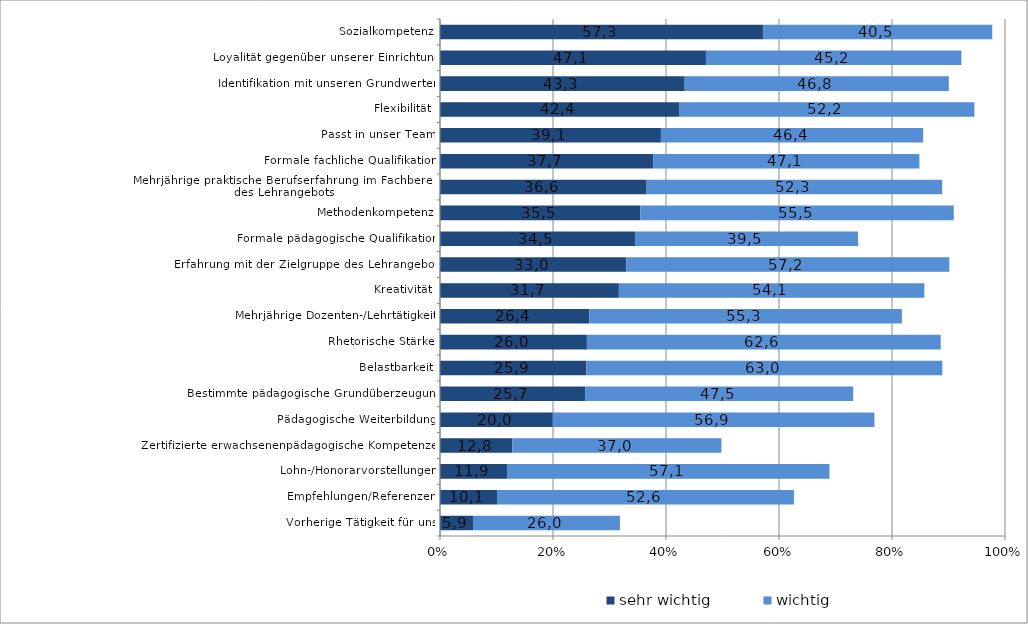
| Category | sehr wichtig | wichtig |
|---|---|---|
| Vorherige Tätigkeit für uns | 0.058 | 0.26 |
| Empfehlungen/Referenzen | 0.101 | 0.526 |
| Lohn-/Honorarvorstellungen | 0.119 | 0.571 |
| Zertifizierte erwachsenenpädagogische Kompetenzen | 0.128 | 0.37 |
| Pädagogische Weiterbildung | 0.2 | 0.569 |
| Bestimmte pädagogische Grundüberzeugung | 0.257 | 0.474 |
| Belastbarkeit | 0.259 | 0.63 |
| Rhetorische Stärke | 0.26 | 0.626 |
| Mehrjährige Dozenten-/Lehrtätigkeit | 0.264 | 0.553 |
| Kreativität | 0.317 | 0.541 |
| Erfahrung mit der Zielgruppe des Lehrangebots | 0.33 | 0.572 |
| Formale pädagogische Qualifikation | 0.345 | 0.395 |
| Methodenkompetenz | 0.355 | 0.554 |
| Mehrjährige praktische Berufserfahrung im Fachbereich des Lehrangebots | 0.366 | 0.523 |
| Formale fachliche Qualifikation | 0.377 | 0.471 |
| Passt in unser Team | 0.391 | 0.464 |
| Flexibilität | 0.424 | 0.522 |
| Identifikation mit unseren Grundwerten | 0.433 | 0.468 |
| Loyalität gegenüber unserer Einrichtung | 0.471 | 0.452 |
| Sozialkompetenz | 0.573 | 0.405 |